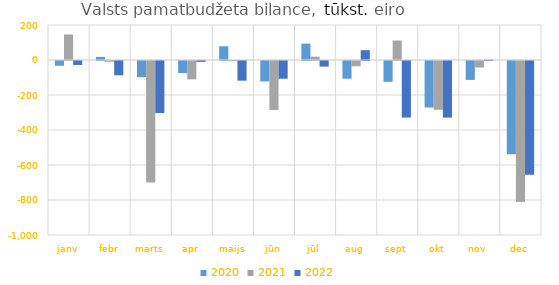
| Category | 2020 | 2021 | 2022 |
|---|---|---|---|
| janv | -27008.783 | 145495.451 | -22576.613 |
| febr | 17739.259 | -4522.432 | -81631.044 |
| marts | -92437.362 | -694525.982 | -297136.226 |
| apr | -68618.758 | -104877.798 | -5088.903 |
| maijs | 78305.058 | -1156.411 | -112366.131 |
| jūn | -116676.414 | -279832.241 | -101334.812 |
| jūl | 93597.468 | 19028.311 | -31986.255 |
| aug | -101242.931 | -30047.233 | 56068.97 |
| sept | -118985.258 | 111497.077 | -323095.809 |
| okt | -265582.087 | -278801.691 | -323290.39 |
| nov | -108180.558 | -37283.727 | 2508.419 |
| dec | -532871.659 | -805850.118 | -649319.296 |